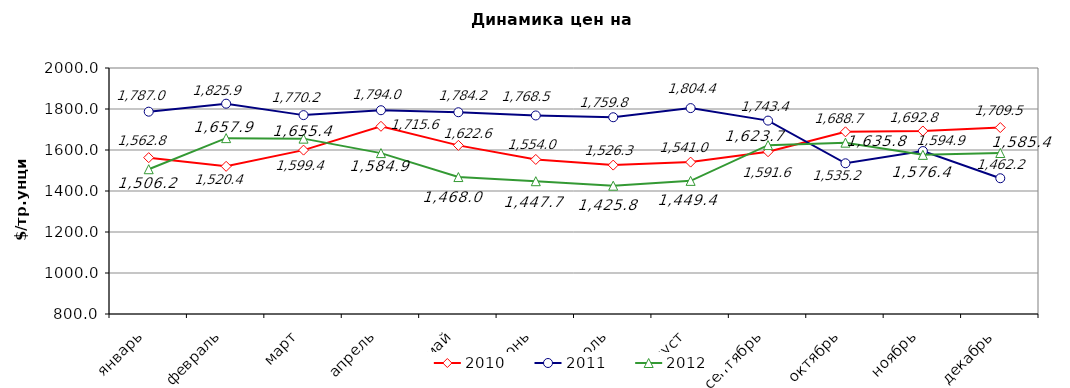
| Category | 2010 | 2011 | 2012 |
|---|---|---|---|
| январь | 1562.75 | 1786.95 | 1506.24 |
| февраль | 1520.35 | 1825.9 | 1657.86 |
| март | 1599.43 | 1770.17 | 1655.41 |
| апрель | 1715.55 | 1794 | 1584.89 |
| май | 1622.58 | 1784.15 | 1468 |
| июнь | 1553.95 | 1768.5 | 1447.74 |
| июль | 1526.32 | 1759.76 | 1425.8 |
| август | 1540.95 | 1804.36 | 1449.4 |
| сентябрь | 1591.61 | 1743.44 | 1623.7 |
| октябрь | 1688.69 | 1535.19 | 1635.83 |
| ноябрь | 1692.77 | 1594.93 | 1576.36 |
| декабрь | 1709.48 | 1462.2 | 1585.42 |